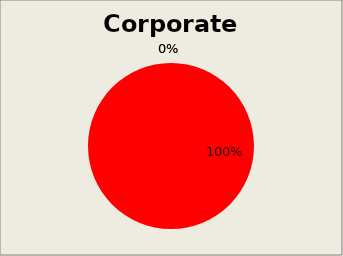
| Category | Series 2 |
|---|---|
| 0 | 0 |
| 1 | 18 |
| 2 | 0 |